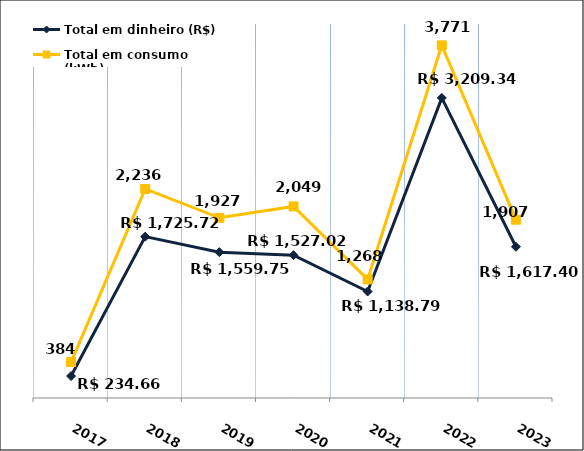
| Category | Total em dinheiro (R$) |
|---|---|
| 2017.0 | 234.66 |
| 2018.0 | 1725.72 |
| 2019.0 | 1559.75 |
| 2020.0 | 1527.02 |
| 2021.0 | 1138.79 |
| 2022.0 | 3209.34 |
| 2023.0 | 1617.4 |